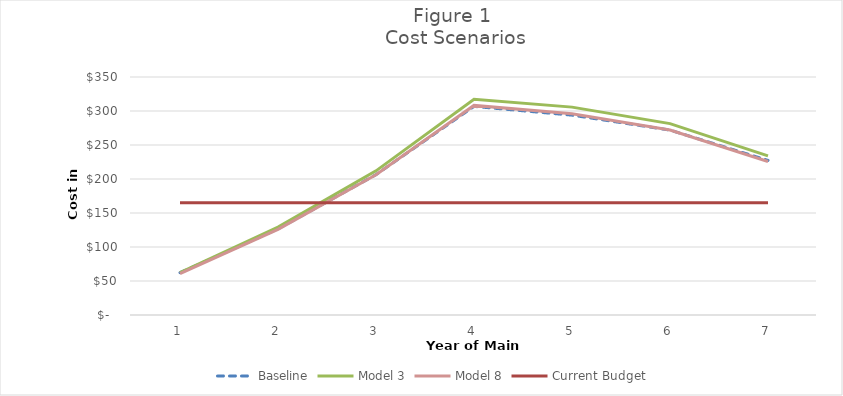
| Category | Baseline | Model 3 | Model 8 | Current Budget |
|---|---|---|---|---|
| 0 | 62.335 | 62.295 | 60.91 | 165 |
| 1 | 126.555 | 129.166 | 125.918 | 165 |
| 2 | 206.411 | 211.979 | 206.22 | 165 |
| 3 | 306.772 | 317.37 | 308.22 | 165 |
| 4 | 293.901 | 305.706 | 296.026 | 165 |
| 5 | 271.922 | 281.449 | 272.038 | 165 |
| 6 | 227.37 | 234.009 | 225.781 | 165 |